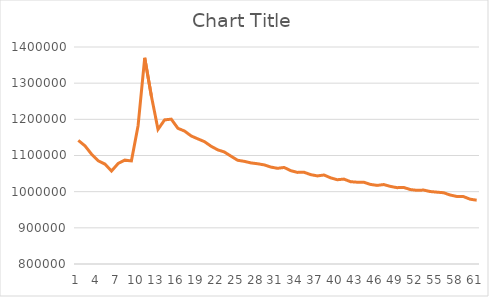
| Category | Series 0 |
|---|---|
| 0 | 1141626.574 |
| 1 | 1126513.609 |
| 2 | 1103634.13 |
| 3 | 1085197.813 |
| 4 | 1076352.067 |
| 5 | 1057172.09 |
| 6 | 1077875.096 |
| 7 | 1087120.761 |
| 8 | 1085094.317 |
| 9 | 1182207.092 |
| 10 | 1370142.694 |
| 11 | 1264759.124 |
| 12 | 1172152.402 |
| 13 | 1198568.288 |
| 14 | 1200452.91 |
| 15 | 1175179.012 |
| 16 | 1167551.031 |
| 17 | 1154040.455 |
| 18 | 1145992.561 |
| 19 | 1138286.014 |
| 20 | 1125525.217 |
| 21 | 1115651.856 |
| 22 | 1109612.304 |
| 23 | 1098092.306 |
| 24 | 1086788.312 |
| 25 | 1083817.511 |
| 26 | 1079484.367 |
| 27 | 1077175.448 |
| 28 | 1074046.583 |
| 29 | 1068012.056 |
| 30 | 1064558.833 |
| 31 | 1066909.63 |
| 32 | 1058052.442 |
| 33 | 1053303.887 |
| 34 | 1053650.685 |
| 35 | 1047105.612 |
| 36 | 1043526.168 |
| 37 | 1046092.193 |
| 38 | 1038212.676 |
| 39 | 1032991.812 |
| 40 | 1034755.622 |
| 41 | 1027606.544 |
| 42 | 1026177.682 |
| 43 | 1026054.395 |
| 44 | 1020086.815 |
| 45 | 1017336.004 |
| 46 | 1019648.986 |
| 47 | 1014582.939 |
| 48 | 1011085.576 |
| 49 | 1011738.609 |
| 50 | 1005833.856 |
| 51 | 1003660.712 |
| 52 | 1004439.27 |
| 53 | 1000370.296 |
| 54 | 998691.425 |
| 55 | 997084.623 |
| 56 | 990829.518 |
| 57 | 986751.399 |
| 58 | 986423.352 |
| 59 | 979273.382 |
| 60 | 976372.658 |